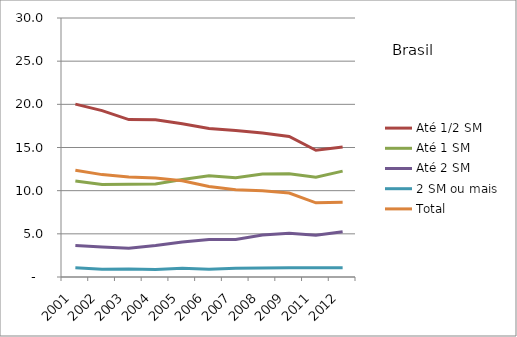
| Category | Até 1/2 SM | Até 1 SM | Até 2 SM | 2 SM ou mais | Total |
|---|---|---|---|---|---|
| 2001.0 | 20.02 | 11.13 | 3.66 | 1.07 | 12.37 |
| 2002.0 | 19.27 | 10.71 | 3.48 | 0.91 | 11.86 |
| 2003.0 | 18.23 | 10.75 | 3.34 | 0.93 | 11.59 |
| 2004.0 | 18.21 | 10.77 | 3.66 | 0.87 | 11.46 |
| 2005.0 | 17.76 | 11.3 | 4.05 | 1 | 11.14 |
| 2006.0 | 17.19 | 11.73 | 4.33 | 0.9 | 10.49 |
| 2007.0 | 16.98 | 11.49 | 4.35 | 1.01 | 10.11 |
| 2008.0 | 16.67 | 11.92 | 4.86 | 1.05 | 9.99 |
| 2009.0 | 16.27 | 11.95 | 5.06 | 1.08 | 9.72 |
| 2011.0 | 14.68 | 11.55 | 4.83 | 1.07 | 8.59 |
| 2012.0 | 15.06 | 12.26 | 5.24 | 1.07 | 8.67 |